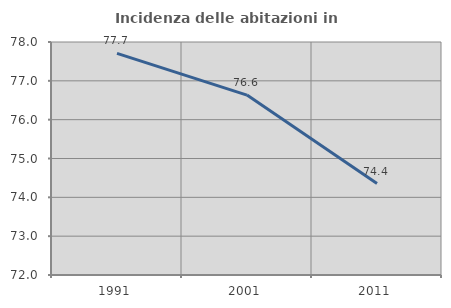
| Category | Incidenza delle abitazioni in proprietà  |
|---|---|
| 1991.0 | 77.707 |
| 2001.0 | 76.633 |
| 2011.0 | 74.356 |